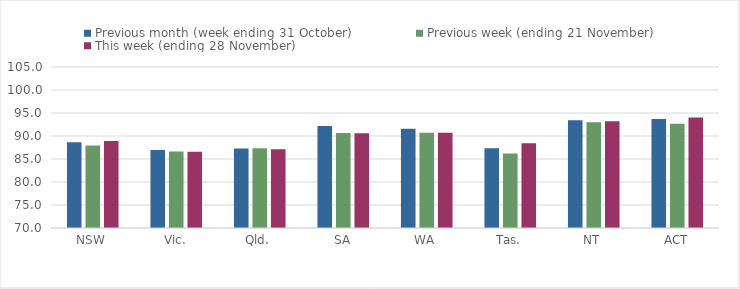
| Category | Previous month (week ending 31 October) | Previous week (ending 21 November) | This week (ending 28 November) |
|---|---|---|---|
| NSW | 88.62 | 87.94 | 88.93 |
| Vic. | 86.97 | 86.64 | 86.59 |
| Qld. | 87.28 | 87.36 | 87.13 |
| SA | 92.15 | 90.64 | 90.6 |
| WA | 91.59 | 90.7 | 90.7 |
| Tas. | 87.34 | 86.18 | 88.43 |
| NT | 93.42 | 93 | 93.19 |
| ACT | 93.7 | 92.67 | 94.04 |